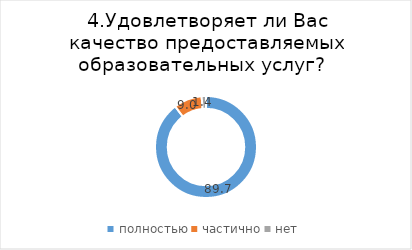
| Category | Series 0 |
|---|---|
| полностью | 89.655 |
| частично | 8.966 |
| нет | 1.379 |